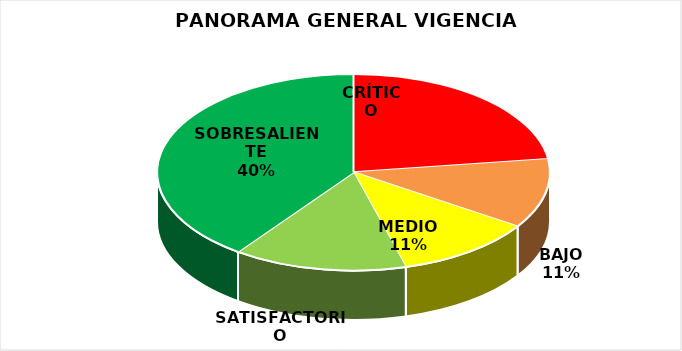
| Category | Series 0 |
|---|---|
| CRÍTICO | 8 |
| BAJO | 4 |
| MEDIO | 4 |
| SATISFACTORIO | 5 |
| SOBRESALIENTE | 14 |